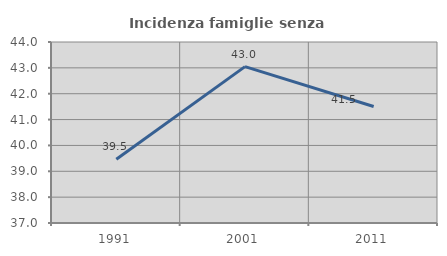
| Category | Incidenza famiglie senza nuclei |
|---|---|
| 1991.0 | 39.463 |
| 2001.0 | 43.048 |
| 2011.0 | 41.507 |